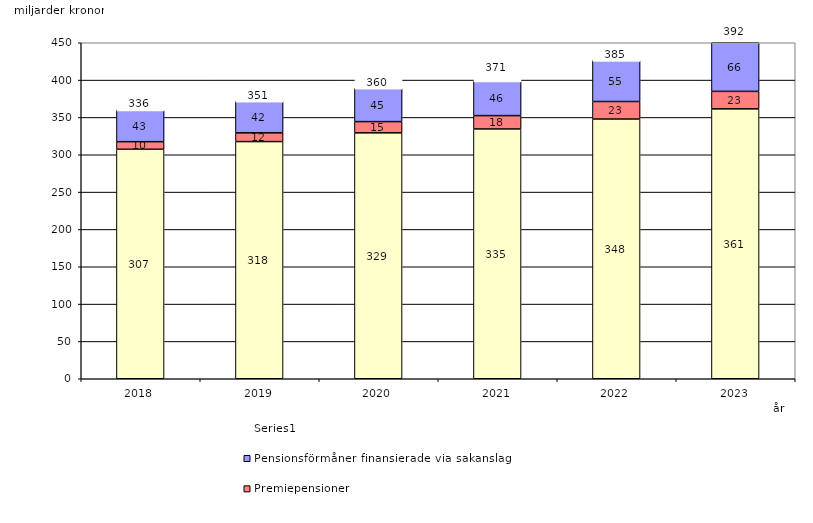
| Category | Inkomstpension och tilläggspension m.m. | Premiepensioner | Pensionsförmåner finansierade via sakanslag | Series 0 |
|---|---|---|---|---|
| 2018.0 | 307.356 | 10.141 | 42.55 | 20 |
| 2019.0 | 317.628 | 11.715 | 42.22 | 20 |
| 2020.0 | 329.365 | 15.016 | 44.546 | 20 |
| 2021.0 | 334.563 | 17.837 | 46.327 | 20 |
| 2022.0 | 347.826 | 23.482 | 55.057 | 20 |
| 2023.0 | 361.479 | 23.415 | 65.892 | 20 |